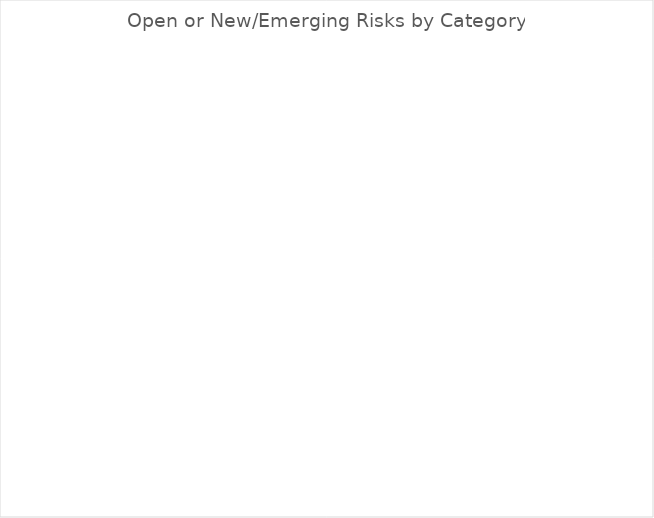
| Category | Series 0 |
|---|---|
| Context | 0 |
| Delivery | 0 |
| Safeguarding | 0 |
| Operational | 0 |
| Fiduciary | 0 |
| Reputational | 0 |